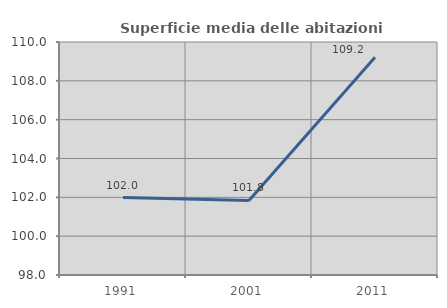
| Category | Superficie media delle abitazioni occupate |
|---|---|
| 1991.0 | 101.986 |
| 2001.0 | 101.841 |
| 2011.0 | 109.21 |